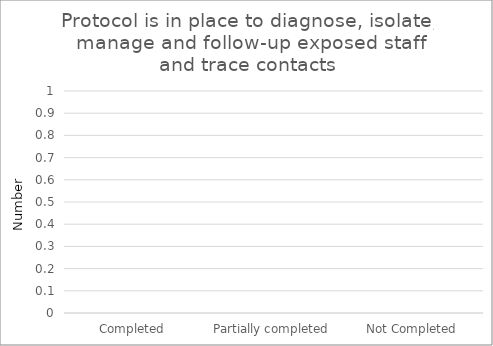
| Category | Protocol is in place to diagnose, isolate, manage and follow-up exposed staff and trace contacts |
|---|---|
| Completed | 0 |
| Partially completed | 0 |
| Not Completed | 0 |